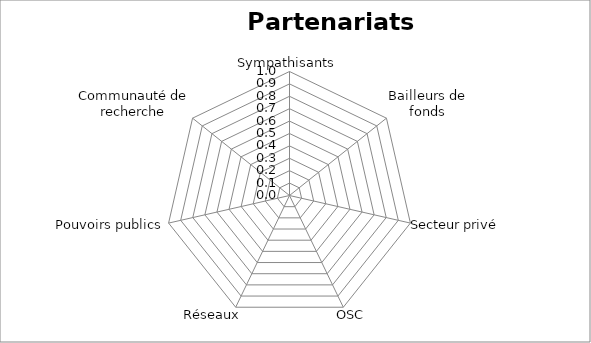
| Category | Series 0 |
|---|---|
| Sympathisants | 0 |
| Bailleurs de fonds | 0 |
| Secteur privé | 0 |
| OSC | 0 |
| Réseaux  | 0 |
| Pouvoirs publics | 0 |
| Communauté de recherche | 0 |